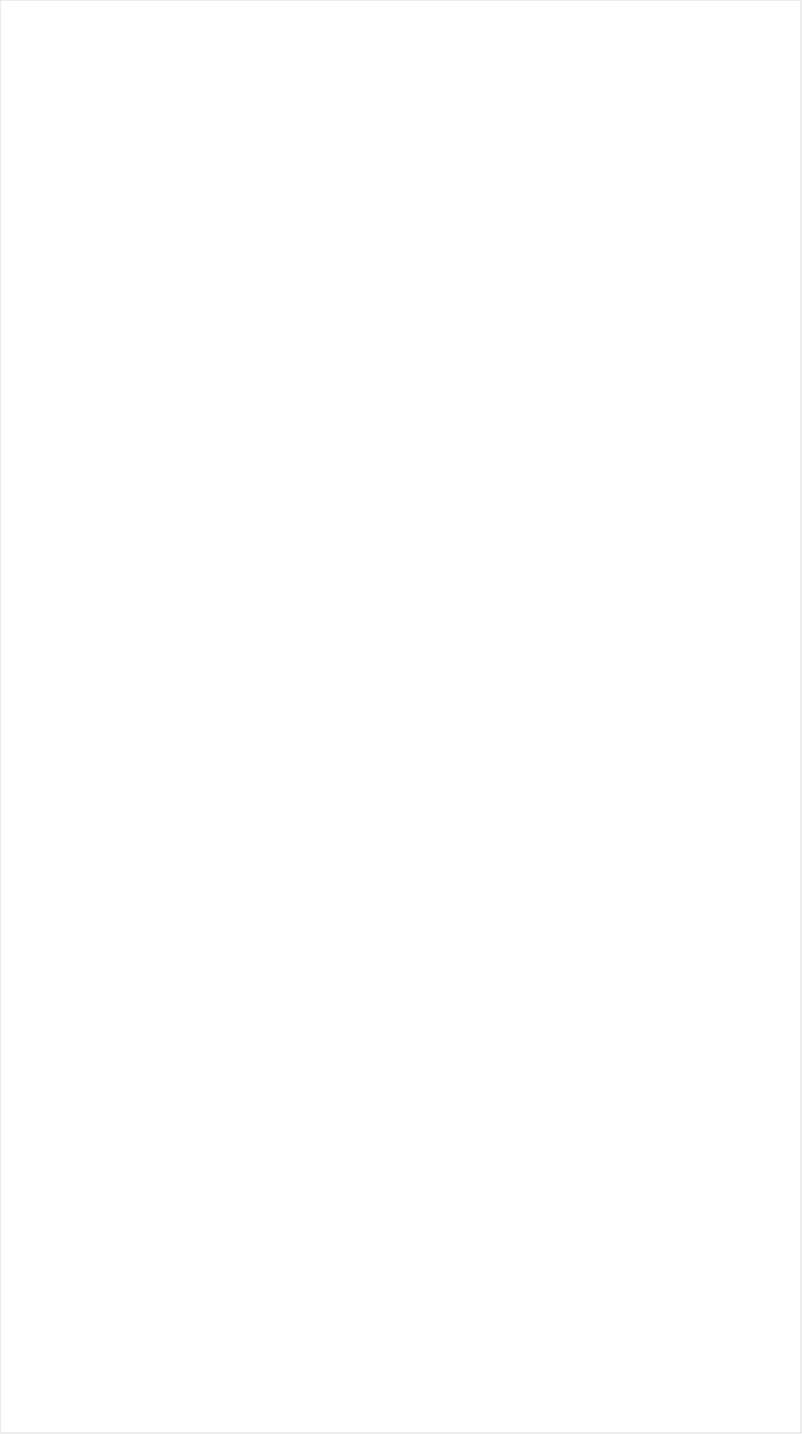
| Category | Total |
|---|---|
| Galavision | -0.918 |
| Telemundo | -0.867 |
| UniMas | -0.849 |
| Univision | -0.808 |
| NBC Universo | -0.789 |
| TUDN | -0.786 |
| TV ONE | -0.654 |
| MTV2 | -0.651 |
| BET Her | -0.64 |
| Cartoon Network | -0.635 |
| BET | -0.621 |
| Nick Toons | -0.618 |
| VH1 | -0.564 |
| Disney XD | -0.556 |
| Teen Nick | -0.516 |
| Disney Channel | -0.503 |
| Lifetime Movies | -0.501 |
| Nick | -0.488 |
| Adult Swim | -0.482 |
| Nick Jr. | -0.451 |
| WE TV | -0.405 |
| Oprah Winfrey Network | -0.399 |
| Travel | -0.384 |
| Disney Junior US | -0.369 |
| TLC | -0.365 |
| Universal Kids | -0.364 |
| Discovery Life Channel | -0.34 |
| Logo | -0.323 |
| Investigation Discovery | -0.316 |
| Nick@Nite | -0.299 |
| FXX | -0.289 |
| OXYGEN | -0.272 |
| Lifetime | -0.26 |
| MTV | -0.255 |
| UP TV | -0.254 |
| USA Network | -0.216 |
| Freeform | -0.184 |
| A&E | -0.183 |
| Discovery Family Channel | -0.165 |
| FX | -0.157 |
| POP | -0.156 |
| E! | -0.143 |
| Hallmark | -0.143 |
| SYFY | -0.127 |
| ION | -0.12 |
| Viceland | -0.109 |
| CMTV | -0.104 |
| INSP | -0.101 |
| Hallmark Movies & Mysteries | -0.07 |
| CW | -0.069 |
| Great American Country | -0.06 |
| FX Movie Channel | -0.048 |
| Paramount Network | -0.047 |
| National Geographic Wild | -0.026 |
| BRAVO | -0.025 |
| NBA TV | -0.015 |
| Science Channel | -0.014 |
| Game Show | 0.008 |
| Reelz Channel | 0.016 |
| TV LAND | 0.018 |
| Comedy Central | 0.045 |
| Animal Planet | 0.047 |
| Ovation | 0.052 |
| Motor Trend Network | 0.057 |
| Discovery Channel | 0.064 |
| BBC America | 0.066 |
| American Heroes Channel | 0.091 |
| CNN | 0.105 |
| MSNBC | 0.115 |
| FYI | 0.115 |
| HGTV | 0.127 |
| Food Network | 0.132 |
| AMC | 0.135 |
| MyNetworkTV | 0.138 |
| History Channel | 0.158 |
| Weather Channel | 0.16 |
| FOX | 0.161 |
| WGN America | 0.173 |
| Cooking Channel | 0.191 |
| SundanceTV | 0.197 |
| Destination America | 0.209 |
| National Geographic | 0.218 |
| ABC | 0.256 |
| Independent Film (IFC) | 0.263 |
| ESPN Deportes | 0.278 |
| DIY | 0.295 |
| RFD TV | 0.298 |
| CBS | 0.356 |
| Smithsonian | 0.363 |
| CNBC | 0.367 |
| NBC | 0.436 |
| Fox News | 0.449 |
| The Sportsman Channel | 0.477 |
| NFL Network | 0.486 |
| ESPNEWS | 0.515 |
| Fox Business | 0.564 |
| Outdoor Channel | 0.565 |
| PBS | 0.574 |
| FXDEP | 0.593 |
| Bloomberg HD | 0.642 |
| Fox Sports 1 | 0.686 |
| ESPN | 0.78 |
| ESPN2 | 0.81 |
| ESPNU | 0.934 |
| FOX Sports 2 | 0.963 |
| PAC-12 Network | 1.012 |
| TNT | 1.05 |
| TBS | 1.081 |
| MLB Network | 1.104 |
| Big Ten Network | 1.105 |
| Olympic Channel | 1.137 |
| Tennis Channel | 1.255 |
| NHL | 1.306 |
| CBS Sports | 1.346 |
| Headline News | 1.679 |
| truTV | 1.987 |
| NBC Sports | 2.294 |
| Golf | 5.737 |